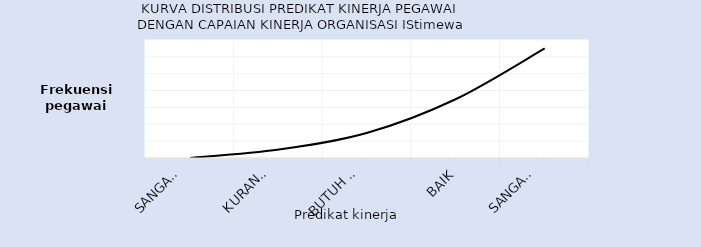
| Category | Series 0 |
|---|---|
| Sangat 
Kurang | 0 |
| Kurang/
Misconduct | 1 |
| Butuh 
Perbaikan | 3 |
| Baik | 7 |
| Sangat 
Baik | 13 |